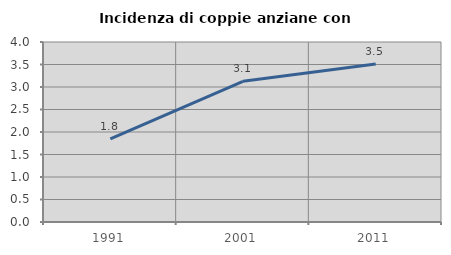
| Category | Incidenza di coppie anziane con figli |
|---|---|
| 1991.0 | 1.845 |
| 2001.0 | 3.127 |
| 2011.0 | 3.51 |